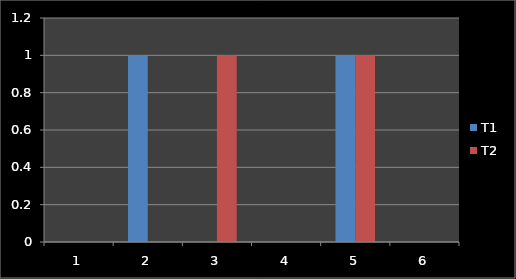
| Category | T1 | T2 |
|---|---|---|
| 1.0 | 0 | 0 |
| 2.0 | 1 | 0 |
| 3.0 | 0 | 1 |
| 4.0 | 0 | 0 |
| 5.0 | 1 | 1 |
| 6.0 | 0 | 0 |